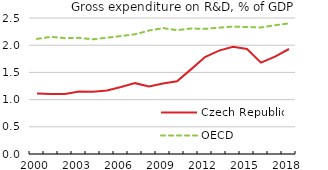
| Category | Czech Republic | OECD |
|---|---|---|
| 2000.0 | 1.113 | 2.116 |
| 2001.0 | 1.103 | 2.153 |
| 2002.0 | 1.102 | 2.129 |
| 2003.0 | 1.147 | 2.135 |
| 2004.0 | 1.146 | 2.108 |
| 2005.0 | 1.168 | 2.138 |
| 2006.0 | 1.232 | 2.168 |
| 2007.0 | 1.302 | 2.2 |
| 2008.0 | 1.239 | 2.269 |
| 2009.0 | 1.294 | 2.315 |
| 2010.0 | 1.337 | 2.276 |
| 2011.0 | 1.556 | 2.307 |
| 2012.0 | 1.782 | 2.3 |
| 2013.0 | 1.9 | 2.322 |
| 2014.0 | 1.973 | 2.343 |
| 2015.0 | 1.929 | 2.334 |
| 2016.0 | 1.68 | 2.326 |
| 2017.0 | 1.791 | 2.367 |
| 2018.0 | 1.93 | 2.401 |